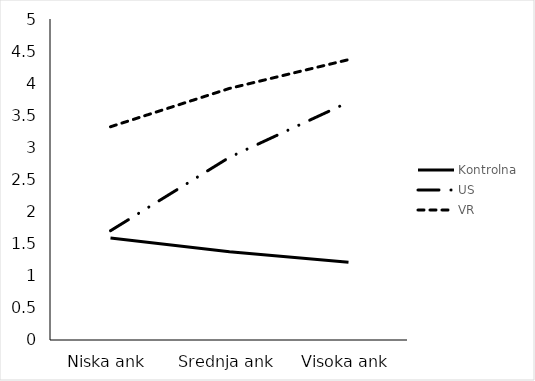
| Category | Kontrolna | US | VR |
|---|---|---|---|
| Niska ank | 1.588 | 1.702 | 3.322 |
| Srednja ank | 1.373 | 2.846 | 3.919 |
| Visoka ank | 1.212 | 3.704 | 4.367 |